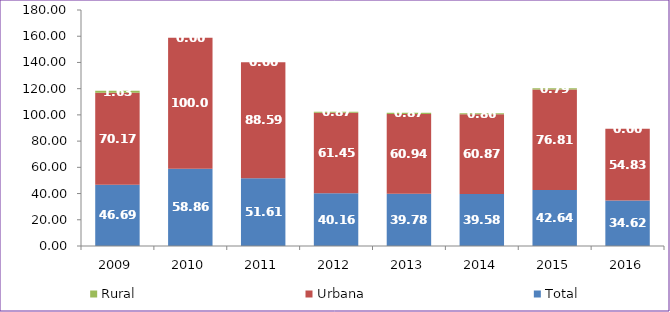
| Category | Total | Urbana | Rural |
|---|---|---|---|
| 2009.0 | 46.69 | 70.17 | 1.63 |
| 2010.0 | 58.86 | 100 | 0 |
| 2011.0 | 51.61 | 88.59 | 0 |
| 2012.0 | 40.16 | 61.45 | 0.87 |
| 2013.0 | 39.78 | 60.94 | 0.87 |
| 2014.0 | 39.58 | 60.87 | 0.86 |
| 2015.0 | 42.64 | 76.81 | 0.79 |
| 2016.0 | 34.62 | 54.83 | 0 |